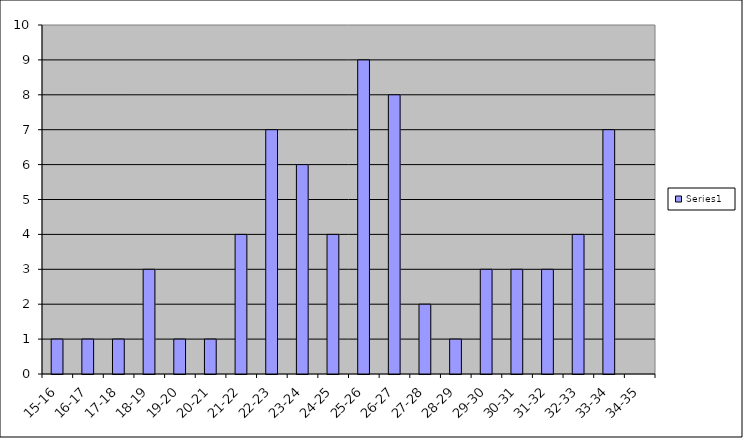
| Category | Series 0 |
|---|---|
| 15-16 | 1 |
| 16-17 | 1 |
| 17-18 | 1 |
| 18-19 | 3 |
| 19-20 | 1 |
| 20-21 | 1 |
| 21-22 | 4 |
| 22-23 | 7 |
| 23-24 | 6 |
| 24-25 | 4 |
| 25-26 | 9 |
| 26-27 | 8 |
| 27-28 | 2 |
| 28-29 | 1 |
| 29-30 | 3 |
| 30-31 | 3 |
| 31-32 | 3 |
| 32-33 | 4 |
| 33-34 | 7 |
| 34-35 | 0 |